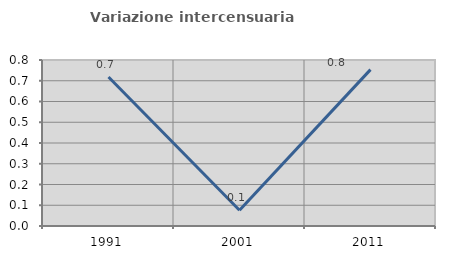
| Category | Variazione intercensuaria annua |
|---|---|
| 1991.0 | 0.718 |
| 2001.0 | 0.076 |
| 2011.0 | 0.754 |